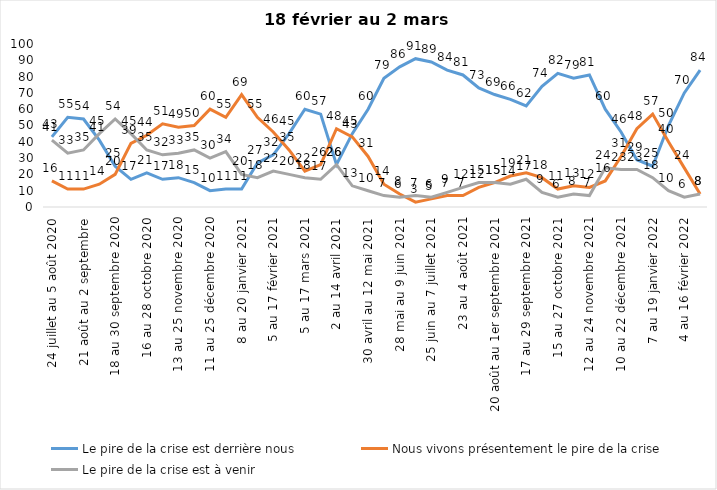
| Category | Le pire de la crise est derrière nous | Nous vivons présentement le pire de la crise | Le pire de la crise est à venir |
|---|---|---|---|
| 24 juillet au 5 août 2020 | 43 | 16 | 41 |
| 7 au 19 août 2020 | 55 | 11 | 33 |
| 21 août au 2 septembre | 54 | 11 | 35 |
| 4 au 16 septembre 2020 | 41 | 14 | 45 |
| 18 au 30 septembre 2020 | 25 | 20 | 54 |
| 2 au 14 octobre 2020 | 17 | 39 | 45 |
| 16 au 28 octobre 2020 | 21 | 44 | 35 |
| 30 octobre au 11 novembre 2020 | 17 | 51 | 32 |
| 13 au 25 novembre 2020 | 18 | 49 | 33 |
| 27 au 9 décembre 2020 | 15 | 50 | 35 |
| 11 au 25 décembre 2020 | 10 | 60 | 30 |
| 25 décembre 2020 au 6 janvier  2021 | 11 | 55 | 34 |
| 8 au 20 janvier 2021 | 11 | 69 | 20 |
| 22 janvier au 3 février 2021 | 27 | 55 | 18 |
| 5 au 17 février 2021 | 32 | 46 | 22 |
| 19 février au 3 mars 2021 | 45 | 35 | 20 |
| 5 au 17 mars 2021 | 60 | 22 | 18 |
| 19 au 31 mars 2021 | 57 | 26 | 17 |
| 2 au 14 avril 2021 | 26 | 48 | 26 |
| 16 au 28 avril 2021 | 45 | 43 | 13 |
| 30 avril au 12 mai 2021 | 60 | 31 | 10 |
| 14 au 26 mai 2021 | 79 | 14 | 7 |
| 28 mai au 9 juin 2021 | 86 | 8 | 6 |
| 11 au 23 juin 2021 | 91 | 3 | 7 |
| 25 juin au 7 juillet 2021 | 89 | 5 | 6 |
| 9 au 21 juillet 2021 | 84 | 7 | 9 |
| 23 au 4 août 2021 | 81 | 7 | 12 |
| 6 au 18 août 2021 | 73 | 12 | 15 |
| 20 août au 1er septembre 2021 | 69 | 15 | 15 |
| 3 au 15 septembre 2021 | 66 | 19 | 14 |
| 17 au 29 septembre 2021 | 62 | 21 | 17 |
| 1 au 13 octobre 2021 | 74 | 18 | 9 |
| 15 au 27 octobre 2021 | 82 | 11 | 6 |
| 29 octobre au 10 novembre 2021 | 79 | 13 | 8 |
| 12 au 24 novembre 2021 | 81 | 12 | 7 |
| 26 novembre au 8 décembre 2021 | 60 | 16 | 24 |
| 10 au 22 décembre 2021 | 46 | 31 | 23 |
| 24 décembre 2021 au 5 janvier 2022 | 29 | 48 | 23 |
| 7 au 19 janvier 2022 | 25 | 57 | 18 |
| 21 janvier au 2 février 2022 | 50 | 40 | 10 |
| 4 au 16 février 2022 | 70 | 24 | 6 |
| 18 février au 2 mars  2022 | 84 | 8 | 8 |